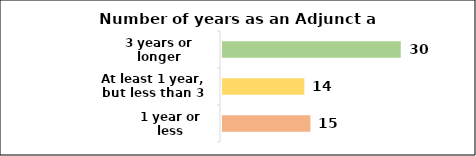
| Category | Series 0 |
|---|---|
| 1 year or less | 15 |
| At least 1 year, but less than 3 years | 14 |
| 3 years or longer | 30 |